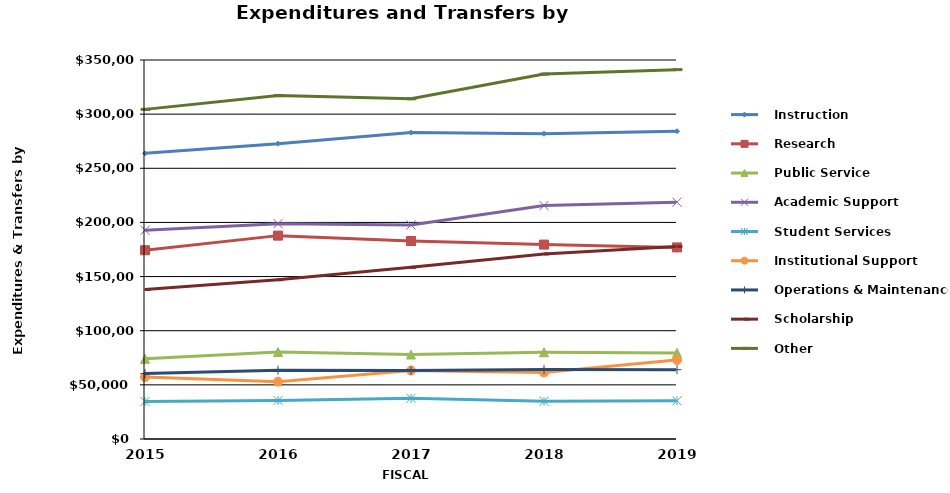
| Category |    Instruction |    Research |    Public Service |    Academic Support |    Student Services |    Institutional Support |    Operations & Maintenance |    Scholarship |    Other |
|---|---|---|---|---|---|---|---|---|---|
| 2015.0 | 263854 | 174300 | 74037 | 192778 | 34613 | 57265 | 60440 | 138042 | 304396 |
| 2016.0 | 272688 | 187807 | 80301 | 198889 | 35623 | 52922 | 63590 | 147065 | 317113 |
| 2017.0 | 282943 | 182846 | 78027 | 197661 | 37622 | 63217 | 63317 | 158591 | 314169 |
| 2018.0 | 281901 | 179547 | 80056 | 215610 | 34883 | 61388 | 64103 | 170941 | 336973 |
| 2019.0 | 284225 | 176924 | 79518 | 218697 | 35240 | 72961 | 64031 | 177815 | 341098 |